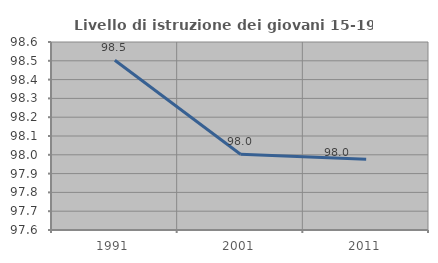
| Category | Livello di istruzione dei giovani 15-19 anni |
|---|---|
| 1991.0 | 98.503 |
| 2001.0 | 98.003 |
| 2011.0 | 97.976 |